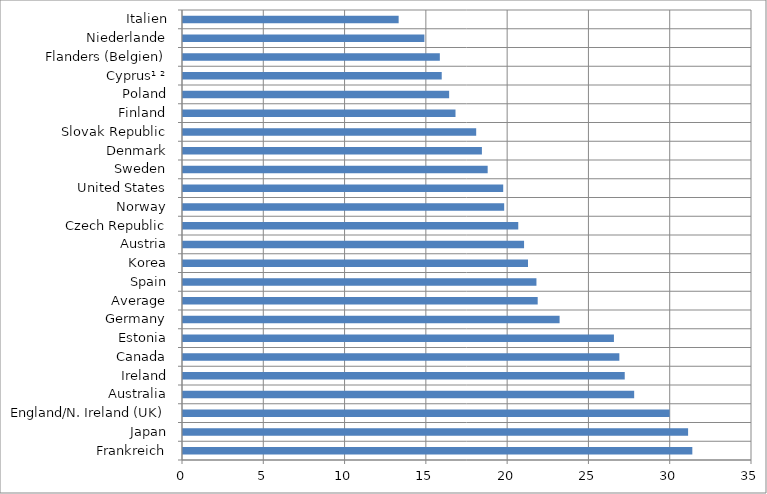
| Category | % |
|---|---|
| Frankreich | 31.33 |
| Japan | 31.069 |
| England/N. Ireland (UK) | 29.933 |
| Australia | 27.752 |
| Ireland | 27.172 |
| Canada | 26.841 |
| Estonia | 26.507 |
| Germany | 23.165 |
| Average | 21.818 |
| Spain | 21.741 |
| Korea | 21.221 |
| Austria | 20.979 |
| Czech Republic | 20.623 |
| Norway | 19.756 |
| United States | 19.697 |
| Sweden | 18.741 |
| Denmark | 18.386 |
| Slovak Republic | 18.034 |
| Finland | 16.762 |
| Poland | 16.37 |
| Cyprus¹ ² | 15.914 |
| Flanders (Belgien) | 15.798 |
| Niederlande | 14.848 |
| Italien | 13.265 |